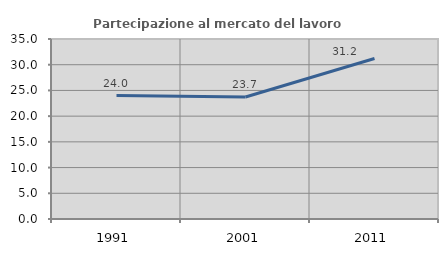
| Category | Partecipazione al mercato del lavoro  femminile |
|---|---|
| 1991.0 | 23.995 |
| 2001.0 | 23.727 |
| 2011.0 | 31.216 |